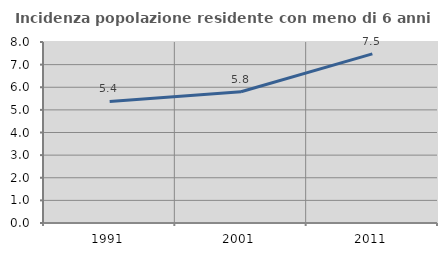
| Category | Incidenza popolazione residente con meno di 6 anni |
|---|---|
| 1991.0 | 5.372 |
| 2001.0 | 5.8 |
| 2011.0 | 7.474 |